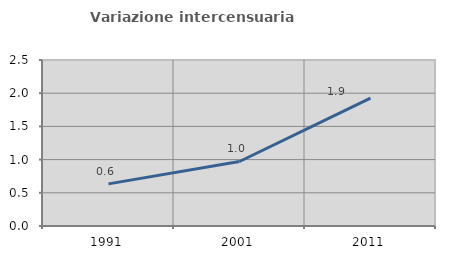
| Category | Variazione intercensuaria annua |
|---|---|
| 1991.0 | 0.635 |
| 2001.0 | 0.972 |
| 2011.0 | 1.925 |